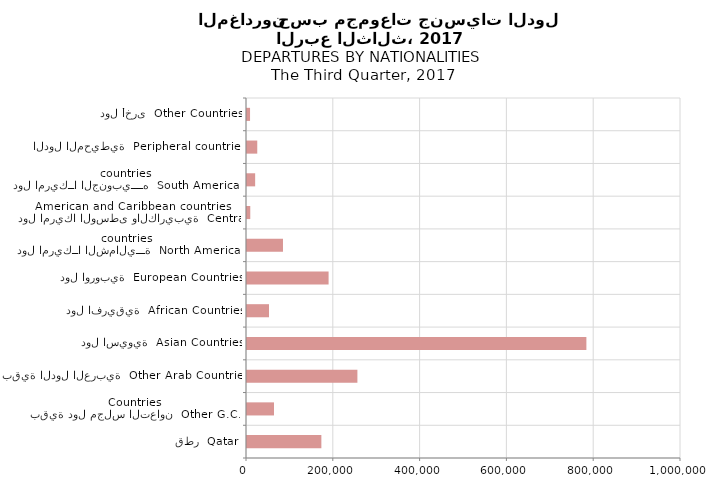
| Category | Series 0 |
|---|---|
| قطر  Qatar | 171346 |
| بقية دول مجلس التعاون  Other G.C.C Countries | 62160 |
| بقية الدول العربية  Other Arab Countries | 254376 |
| دول اسيوية  Asian Countries | 782002 |
| دول افريقية  African Countries | 50681 |
| دول اوروبية  European Countries | 188003 |
| دول امريكــا الشماليـــة  North American countries  | 82917 |
| دول امريكا الوسطى والكاريبية  Central American and Caribbean countries | 7528 |
| دول امريكــا الجنوبيــــه  South American countries | 18794 |
| الدول المحيطية  Peripheral countries | 23634 |
| دول أخرى  Other Countries | 7004 |